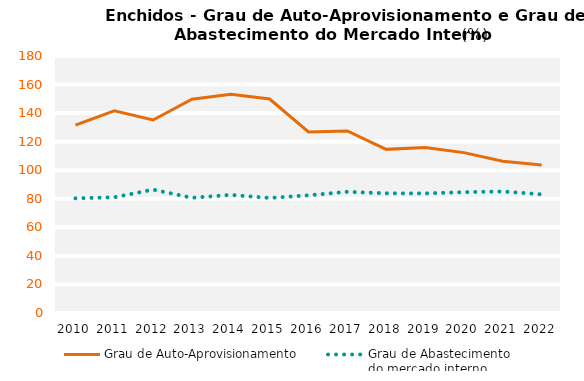
| Category | Grau de Auto-Aprovisionamento | Grau de Abastecimento
do mercado interno |
|---|---|---|
| 2010.0 | 131.545 | 80.315 |
| 2011.0 | 141.654 | 81.051 |
| 2012.0 | 135.194 | 86.407 |
| 2013.0 | 149.743 | 80.685 |
| 2014.0 | 153.183 | 82.745 |
| 2015.0 | 149.88 | 80.559 |
| 2016.0 | 126.779 | 82.424 |
| 2017.0 | 127.48 | 84.896 |
| 2018.0 | 114.605 | 83.81 |
| 2019.0 | 115.859 | 83.757 |
| 2020.0 | 112.325 | 84.637 |
| 2021.0 | 106.282 | 85.11 |
| 2022.0 | 103.709 | 83.099 |